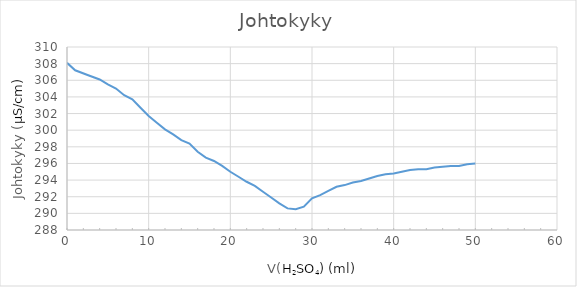
| Category | Johtokyky |
|---|---|
| 0.0 | 308.1 |
| 1.0 | 307.2 |
| 2.6 | 306.6 |
| 4.0 | 306.1 |
| 5.0 | 305.5 |
| 6.0 | 305 |
| 7.0 | 304.2 |
| 8.0 | 303.7 |
| 9.0 | 302.7 |
| 10.0 | 301.7 |
| 11.0 | 300.9 |
| 12.0 | 300.1 |
| 13.0 | 299.5 |
| 14.0 | 298.8 |
| 15.0 | 298.4 |
| 16.0 | 297.4 |
| 17.0 | 296.7 |
| 18.0 | 296.3 |
| 19.0 | 295.7 |
| 20.0 | 295 |
| 21.0 | 294.4 |
| 22.0 | 293.8 |
| 23.0 | 293.3 |
| 24.0 | 292.6 |
| 25.0 | 291.9 |
| 26.0 | 291.2 |
| 27.0 | 290.6 |
| 28.0 | 290.5 |
| 29.0 | 290.8 |
| 30.0 | 291.8 |
| 31.0 | 292.2 |
| 32.0 | 292.7 |
| 33.0 | 293.2 |
| 34.0 | 293.4 |
| 35.0 | 293.7 |
| 36.0 | 293.9 |
| 37.0 | 294.2 |
| 38.0 | 294.5 |
| 39.0 | 294.7 |
| 40.0 | 294.8 |
| 41.0 | 295 |
| 42.0 | 295.2 |
| 43.0 | 295.3 |
| 44.0 | 295.3 |
| 45.0 | 295.5 |
| 46.0 | 295.6 |
| 47.0 | 295.7 |
| 48.0 | 295.7 |
| 49.0 | 295.9 |
| 50.0 | 296 |